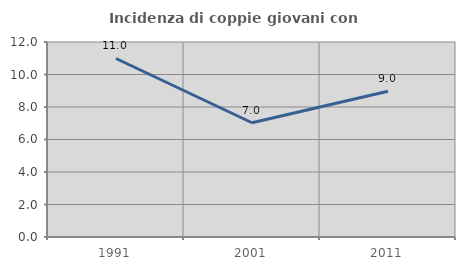
| Category | Incidenza di coppie giovani con figli |
|---|---|
| 1991.0 | 10.985 |
| 2001.0 | 7.031 |
| 2011.0 | 8.966 |